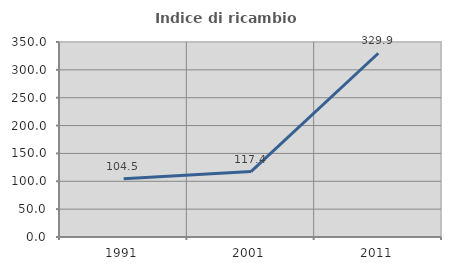
| Category | Indice di ricambio occupazionale  |
|---|---|
| 1991.0 | 104.516 |
| 2001.0 | 117.355 |
| 2011.0 | 329.851 |